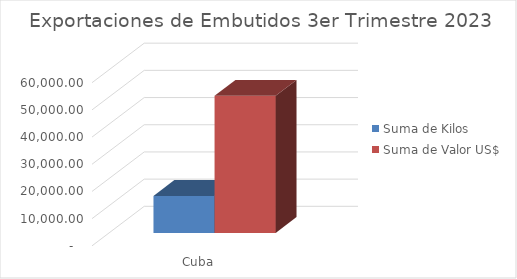
| Category | Suma de Kilos | Suma de Valor US$ |
|---|---|---|
| Cuba | 13607.78 | 50432.4 |